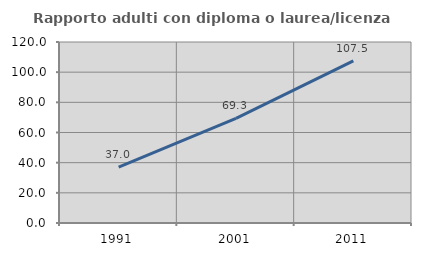
| Category | Rapporto adulti con diploma o laurea/licenza media  |
|---|---|
| 1991.0 | 37.037 |
| 2001.0 | 69.35 |
| 2011.0 | 107.514 |